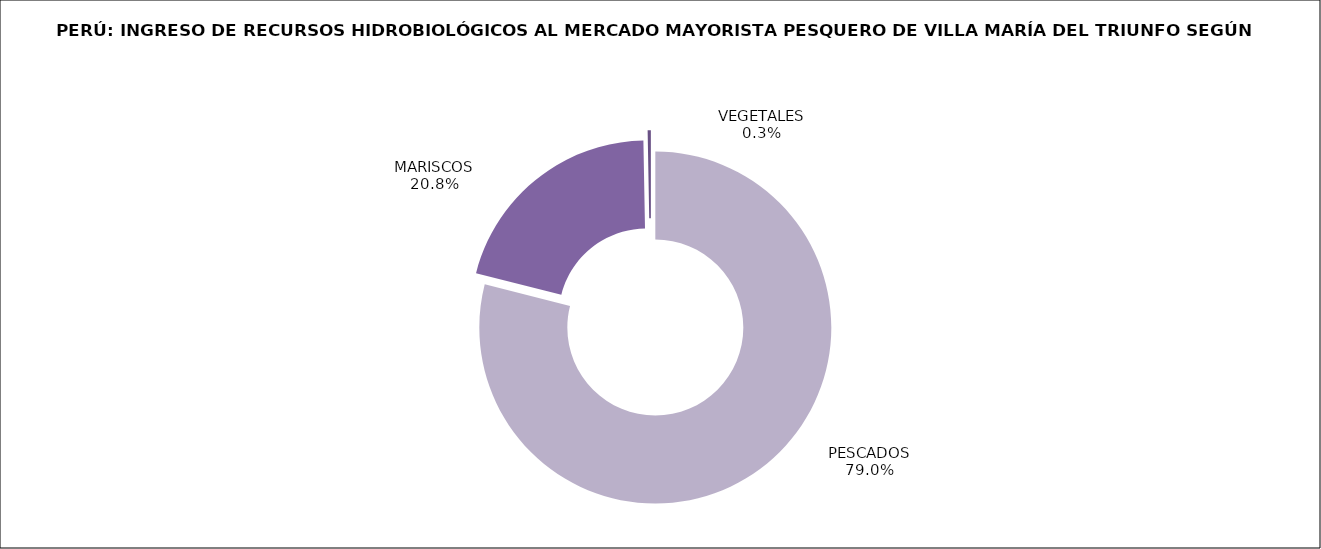
| Category | Series 0 |
|---|---|
| PESCADOS | 55317.112 |
| MARISCOS | 14537.737 |
| VEGETALES | 204.985 |